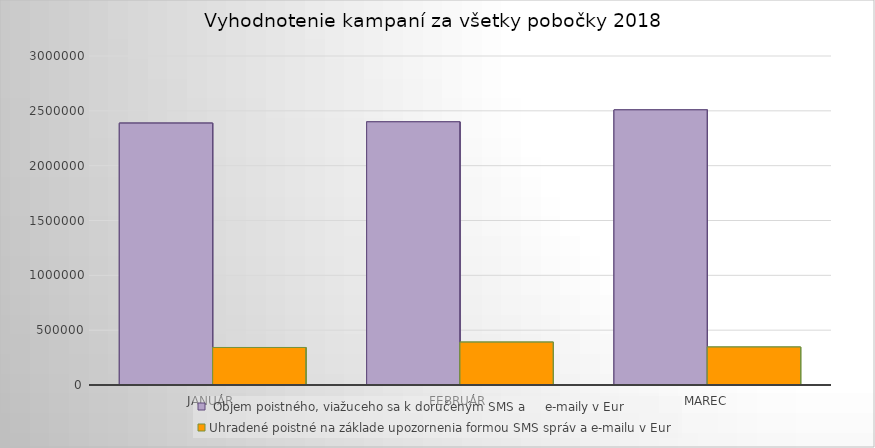
| Category |  Objem poistného, viažuceho sa k doručeným SMS a     e-maily v Eur | Uhradené poistné na základe upozornenia formou SMS správ a e-mailu v Eur |
|---|---|---|
| Január | 2387824.62 | 342038.79 |
| Február | 2399628.43 | 390870.91 |
| Marec | 2508830.79 | 345989.86 |